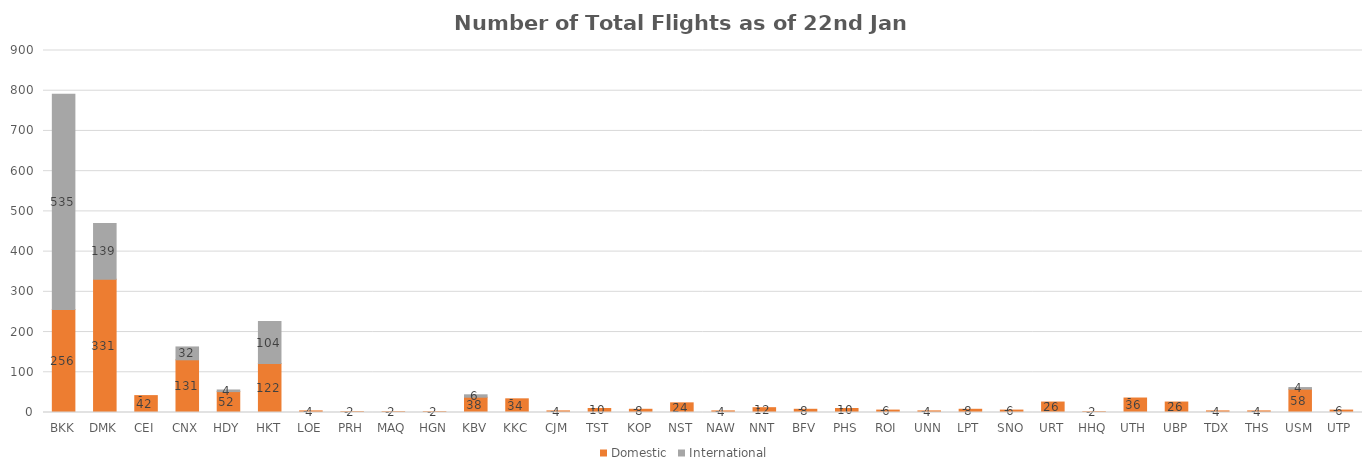
| Category | Domestic | International |
|---|---|---|
| BKK | 256 | 535 |
| DMK | 331 | 139 |
| CEI | 42 | 0 |
| CNX | 131 | 32 |
| HDY | 52 | 4 |
| HKT | 122 | 104 |
| LOE | 4 | 0 |
| PRH | 2 | 0 |
| MAQ | 2 | 0 |
| HGN | 2 | 0 |
| KBV | 38 | 6 |
| KKC | 34 | 0 |
| CJM | 4 | 0 |
| TST | 10 | 0 |
| KOP | 8 | 0 |
| NST | 24 | 0 |
| NAW | 4 | 0 |
| NNT | 12 | 0 |
| BFV | 8 | 0 |
| PHS | 10 | 0 |
| ROI | 6 | 0 |
| UNN | 4 | 0 |
| LPT | 8 | 0 |
| SNO | 6 | 0 |
| URT | 26 | 0 |
| HHQ | 2 | 0 |
| UTH | 36 | 0 |
| UBP | 26 | 0 |
| TDX | 4 | 0 |
| THS | 4 | 0 |
| USM | 58 | 4 |
| UTP | 6 | 0 |